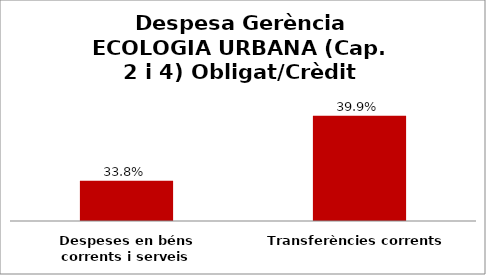
| Category | Series 0 |
|---|---|
| Despeses en béns corrents i serveis | 0.338 |
| Transferències corrents | 0.399 |